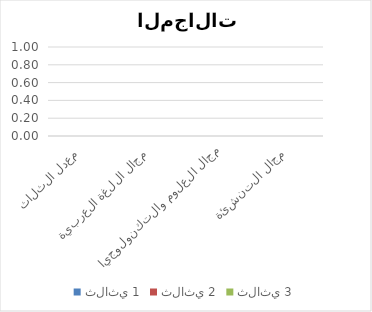
| Category | ثلاثي 1 | ثلاثي 2 | ثلاثي 3 |
|---|---|---|---|
| معدل الثلاثي | 0 | 0 | 0 |
| مجال اللغة العربية | 0 | 0 | 0 |
| مجال العلوم والتكنولوجيا | 0 | 0 | 0 |
| مجال التنشئة | 0 | 0 | 0 |